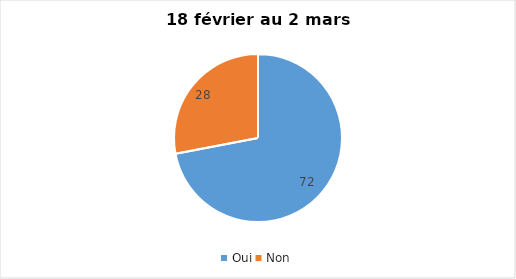
| Category | Series 0 |
|---|---|
| Oui | 72 |
| Non | 28 |